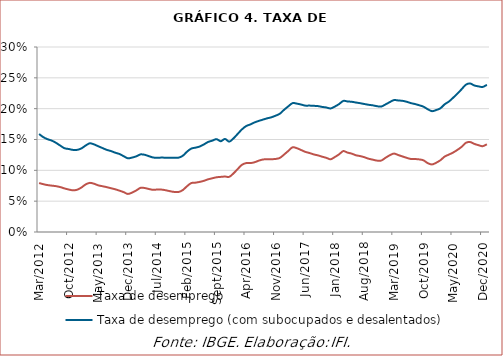
| Category | Taxa de desemprego | Taxa de desemprego (com subocupados e desalentados) |
|---|---|---|
| 2012-03-01 | 0.079 | 0.159 |
| 2012-04-01 | 0.077 | 0.154 |
| 2012-05-01 | 0.076 | 0.15 |
| 2012-06-01 | 0.075 | 0.148 |
| 2012-07-01 | 0.074 | 0.145 |
| 2012-08-01 | 0.073 | 0.14 |
| 2012-09-01 | 0.071 | 0.136 |
| 2012-10-01 | 0.069 | 0.135 |
| 2012-11-01 | 0.068 | 0.133 |
| 2012-12-01 | 0.069 | 0.133 |
| 2013-01-01 | 0.072 | 0.135 |
| 2013-02-01 | 0.077 | 0.14 |
| 2013-03-01 | 0.08 | 0.144 |
| 2013-04-01 | 0.078 | 0.142 |
| 2013-05-01 | 0.076 | 0.139 |
| 2013-06-01 | 0.074 | 0.136 |
| 2013-07-01 | 0.073 | 0.133 |
| 2013-08-01 | 0.071 | 0.131 |
| 2013-09-01 | 0.069 | 0.129 |
| 2013-10-01 | 0.067 | 0.127 |
| 2013-11-01 | 0.065 | 0.123 |
| 2013-12-01 | 0.062 | 0.12 |
| 2014-01-01 | 0.064 | 0.121 |
| 2014-02-01 | 0.067 | 0.123 |
| 2014-03-01 | 0.072 | 0.126 |
| 2014-04-01 | 0.071 | 0.125 |
| 2014-05-01 | 0.07 | 0.123 |
| 2014-06-01 | 0.068 | 0.121 |
| 2014-07-01 | 0.069 | 0.12 |
| 2014-08-01 | 0.069 | 0.121 |
| 2014-09-01 | 0.068 | 0.12 |
| 2014-10-01 | 0.066 | 0.12 |
| 2014-11-01 | 0.065 | 0.12 |
| 2014-12-01 | 0.065 | 0.121 |
| 2015-01-01 | 0.068 | 0.124 |
| 2015-02-01 | 0.074 | 0.13 |
| 2015-03-01 | 0.079 | 0.135 |
| 2015-04-01 | 0.08 | 0.137 |
| 2015-05-01 | 0.081 | 0.139 |
| 2015-06-01 | 0.083 | 0.142 |
| 2015-07-01 | 0.085 | 0.146 |
| 2015-08-01 | 0.087 | 0.148 |
| 2015-09-01 | 0.089 | 0.151 |
| 2015-10-01 | 0.089 | 0.147 |
| 2015-11-01 | 0.09 | 0.151 |
| 2015-12-01 | 0.089 | 0.147 |
| 2016-01-01 | 0.095 | 0.152 |
| 2016-02-01 | 0.102 | 0.159 |
| 2016-03-01 | 0.109 | 0.166 |
| 2016-04-01 | 0.112 | 0.172 |
| 2016-05-01 | 0.112 | 0.174 |
| 2016-06-01 | 0.113 | 0.178 |
| 2016-07-01 | 0.116 | 0.18 |
| 2016-08-01 | 0.118 | 0.182 |
| 2016-09-01 | 0.118 | 0.184 |
| 2016-10-01 | 0.118 | 0.186 |
| 2016-11-01 | 0.118 | 0.189 |
| 2016-12-01 | 0.12 | 0.192 |
| 2017-01-01 | 0.126 | 0.198 |
| 2017-02-01 | 0.132 | 0.204 |
| 2017-03-01 | 0.137 | 0.209 |
| 2017-04-01 | 0.136 | 0.208 |
| 2017-05-01 | 0.133 | 0.207 |
| 2017-06-01 | 0.13 | 0.205 |
| 2017-07-01 | 0.128 | 0.205 |
| 2017-08-01 | 0.126 | 0.205 |
| 2017-09-01 | 0.124 | 0.204 |
| 2017-10-01 | 0.122 | 0.203 |
| 2017-11-01 | 0.12 | 0.202 |
| 2017-12-01 | 0.118 | 0.2 |
| 2018-01-01 | 0.122 | 0.203 |
| 2018-02-01 | 0.126 | 0.207 |
| 2018-03-01 | 0.131 | 0.213 |
| 2018-04-01 | 0.129 | 0.212 |
| 2018-05-01 | 0.127 | 0.211 |
| 2018-06-01 | 0.124 | 0.21 |
| 2018-07-01 | 0.123 | 0.209 |
| 2018-08-01 | 0.121 | 0.208 |
| 2018-09-01 | 0.119 | 0.206 |
| 2018-10-01 | 0.117 | 0.205 |
| 2018-11-01 | 0.116 | 0.204 |
| 2018-12-01 | 0.116 | 0.203 |
| 2019-01-01 | 0.12 | 0.207 |
| 2019-02-01 | 0.124 | 0.211 |
| 2019-03-01 | 0.127 | 0.214 |
| 2019-04-01 | 0.125 | 0.213 |
| 2019-05-01 | 0.123 | 0.213 |
| 2019-06-01 | 0.12 | 0.211 |
| 2019-07-01 | 0.118 | 0.209 |
| 2019-08-01 | 0.118 | 0.207 |
| 2019-09-01 | 0.118 | 0.206 |
| 2019-10-01 | 0.116 | 0.203 |
| 2019-11-01 | 0.112 | 0.199 |
| 2019-12-01 | 0.11 | 0.196 |
| 2020-01-01 | 0.112 | 0.198 |
| 2020-02-01 | 0.116 | 0.201 |
| 2020-03-01 | 0.122 | 0.207 |
| 2020-04-01 | 0.126 | 0.211 |
| 2020-05-01 | 0.129 | 0.218 |
| 2020-06-01 | 0.133 | 0.224 |
| 2020-07-01 | 0.138 | 0.231 |
| 2020-08-01 | 0.145 | 0.239 |
| 2020-09-01 | 0.146 | 0.241 |
| 2020-10-01 | 0.143 | 0.238 |
| 2020-11-01 | 0.141 | 0.236 |
| 2020-12-01 | 0.139 | 0.235 |
| 2021-01-01 | 0.142 | 0.239 |